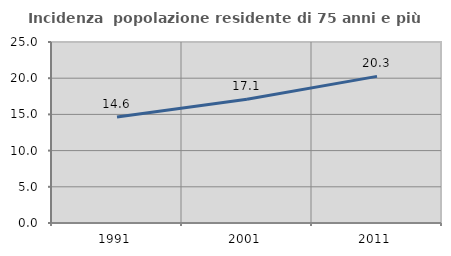
| Category | Incidenza  popolazione residente di 75 anni e più |
|---|---|
| 1991.0 | 14.641 |
| 2001.0 | 17.105 |
| 2011.0 | 20.251 |